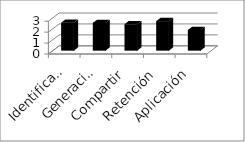
| Category | Series 0 |
|---|---|
| Identificación | 2.559 |
| Generación  | 2.534 |
| Compartir | 2.416 |
| Retención | 2.698 |
| Aplicación | 1.894 |